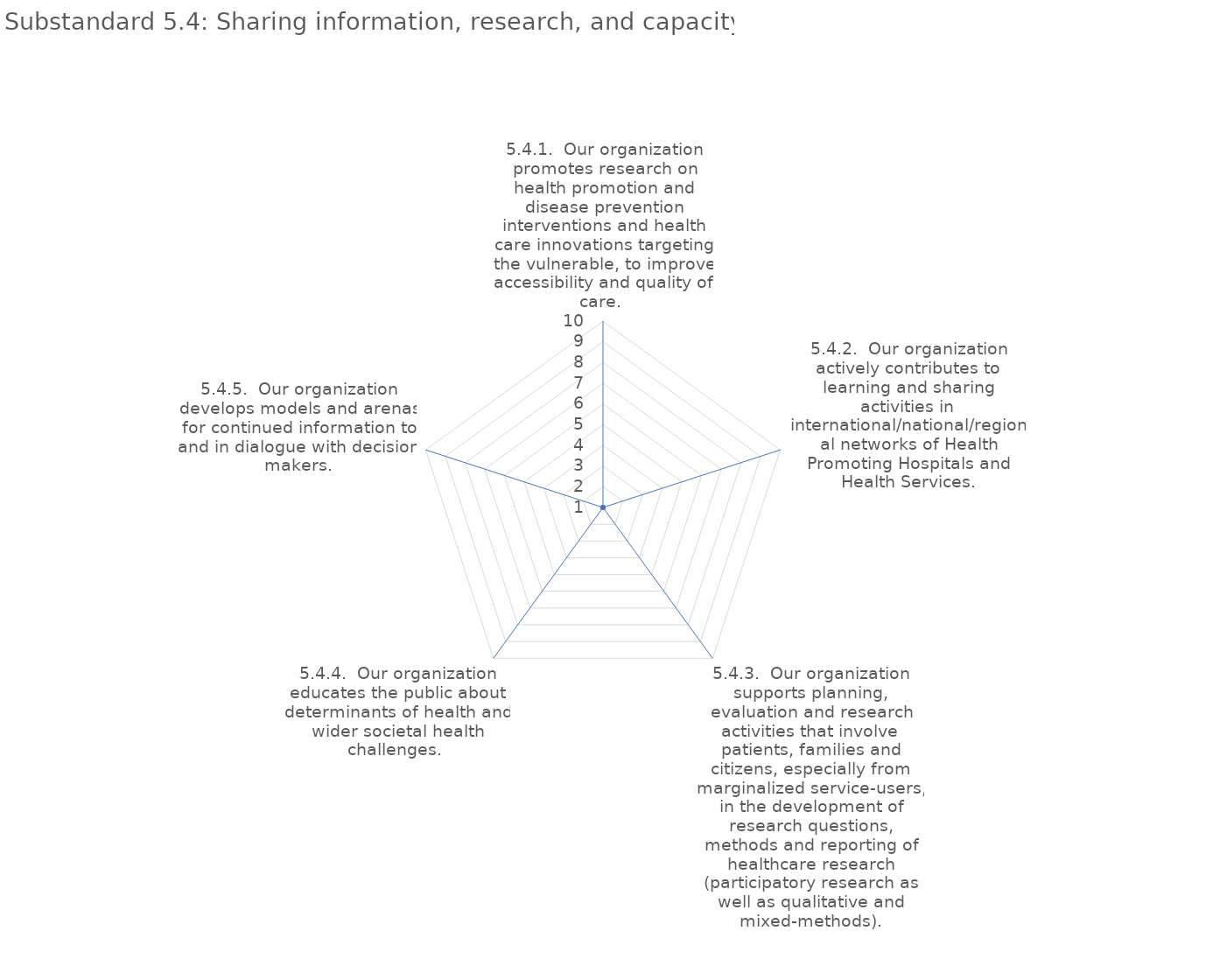
| Category | value |
|---|---|
| 5.4.1.  Our organization promotes research on health promotion and disease prevention interventions and health care innovations targeting the vulnerable, to improve accessibility and quality of care.  | 1 |
| 5.4.2.  Our organization actively contributes to learning and sharing activities in international/national/regional networks of Health Promoting Hospitals and Health Services. | 1 |
| 5.4.3.  Our organization supports planning, evaluation and research activities that involve patients, families and citizens, especially from marginalized service-users, in the development of research questions, methods and reporting of healthcare research  | 1 |
| 5.4.4.  Our organization educates the public about determinants of health and wider societal health challenges.  | 1 |
| 5.4.5.  Our organization develops models and arenas for continued information to and in dialogue with decision makers. | 1 |